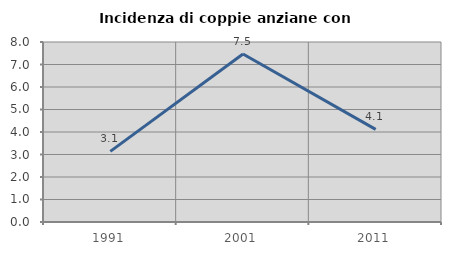
| Category | Incidenza di coppie anziane con figli |
|---|---|
| 1991.0 | 3.138 |
| 2001.0 | 7.467 |
| 2011.0 | 4.117 |